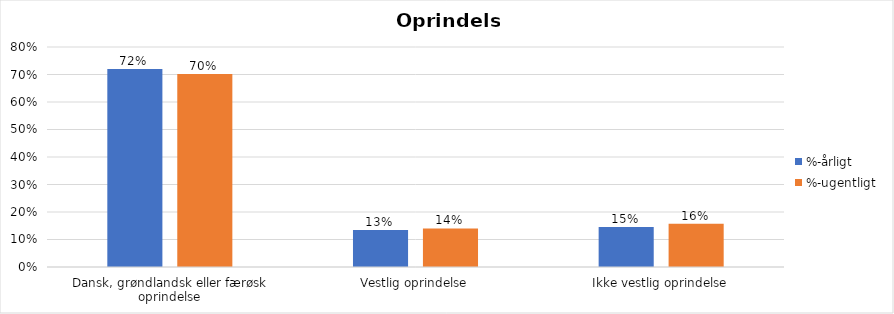
| Category | %-årligt | %-ugentligt |
|---|---|---|
| Dansk, grøndlandsk eller færøsk oprindelse | 0.72 | 0.702 |
| Vestlig oprindelse | 0.134 | 0.14 |
| Ikke vestlig oprindelse | 0.146 | 0.157 |